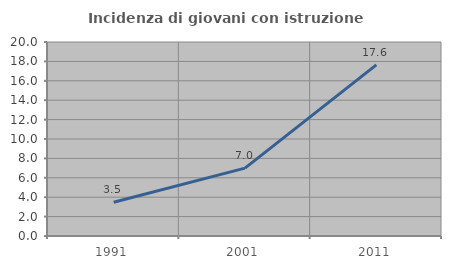
| Category | Incidenza di giovani con istruzione universitaria |
|---|---|
| 1991.0 | 3.472 |
| 2001.0 | 7 |
| 2011.0 | 17.647 |